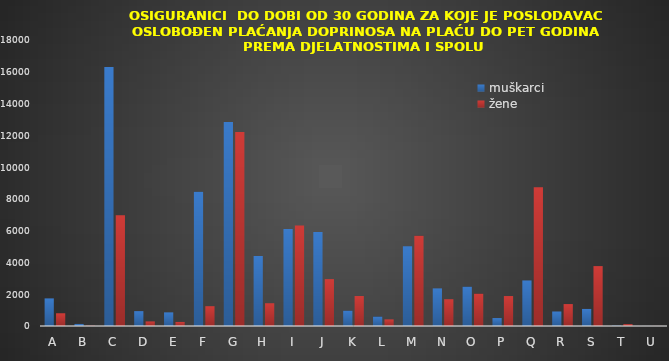
| Category | muškarci | žene |
|---|---|---|
| A | 1738 | 802 |
| B | 129 | 18 |
| C | 16308 | 6969 |
| D | 936 | 288 |
| E | 858 | 257 |
| F | 8455 | 1247 |
| G | 12839 | 12206 |
| H | 4404 | 1433 |
| I | 6101 | 6332 |
| J | 5920 | 2950 |
| K | 967 | 1886 |
| L | 596 | 417 |
| M | 5018 | 5678 |
| N | 2367 | 1686 |
| O | 2476 | 2036 |
| P | 500 | 1885 |
| Q | 2868 | 8740 |
| R | 913 | 1380 |
| S | 1075 | 3770 |
| T | 23 | 118 |
| U | 3 | 5 |